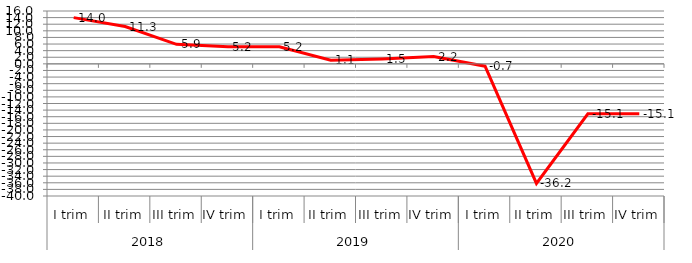
| Category | Rapporti di lavoro cessati |
|---|---|
| 0 | 14 |
| 1 | 11.3 |
| 2 | 5.9 |
| 3 | 5.2 |
| 4 | 5.2 |
| 5 | 1.1 |
| 6 | 1.5 |
| 7 | 2.2 |
| 8 | -0.7 |
| 9 | -36.2 |
| 10 | -15.1 |
| 11 | -15.1 |